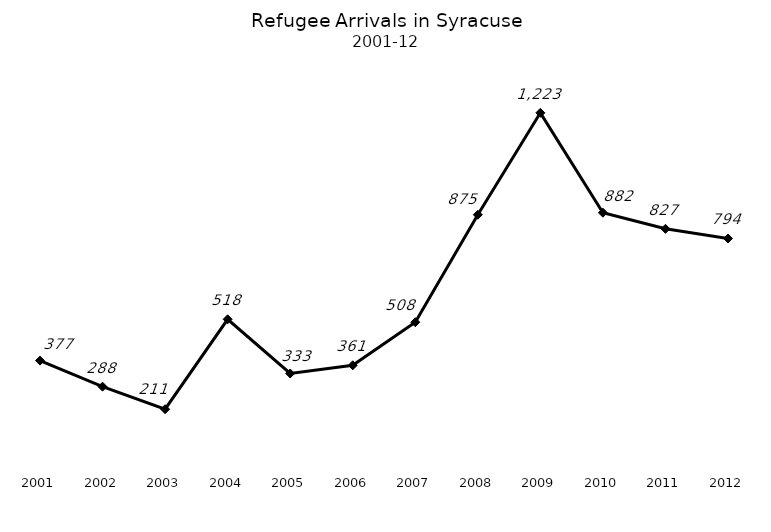
| Category | Series 0 |
|---|---|
| 2001.0 | 377 |
| 2002.0 | 288 |
| 2003.0 | 211 |
| 2004.0 | 518 |
| 2005.0 | 333 |
| 2006.0 | 361 |
| 2007.0 | 508 |
| 2008.0 | 875 |
| 2009.0 | 1223 |
| 2010.0 | 882 |
| 2011.0 | 827 |
| 2012.0 | 794 |